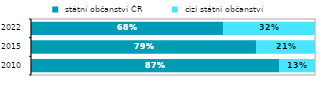
| Category |  státní občanství ČR |  cizí státní občanství |
|---|---|---|
| 2010.0 | 0.873 | 0.127 |
| 2015.0 | 0.794 | 0.206 |
| 2022.0 | 0.676 | 0.324 |